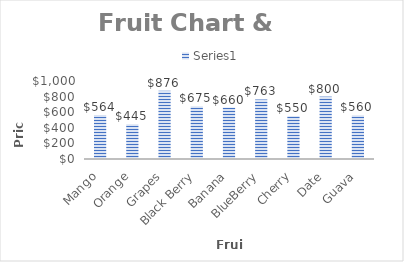
| Category | Series 0 |
|---|---|
| Mango | 564 |
| Orange | 445 |
| Grapes | 876 |
| Black Berry | 675 |
| Banana | 660 |
| BlueBerry | 763 |
| Cherry | 550 |
| Date | 800 |
| Guava | 560 |